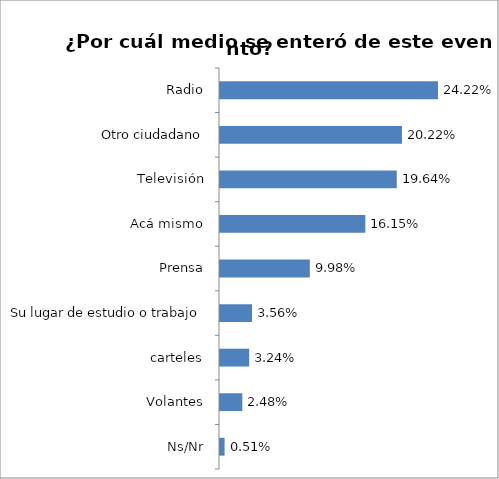
| Category | Total |
|---|---|
| Ns/Nr | 0.005 |
| Volantes, carteles | 0.025 |
| Su lugar de estudio o trabajo | 0.032 |
| Prensa | 0.036 |
| Acá mismo | 0.1 |
| Televisión | 0.161 |
| Otro ciudadano | 0.196 |
| Radio | 0.202 |
| Internet | 0.242 |